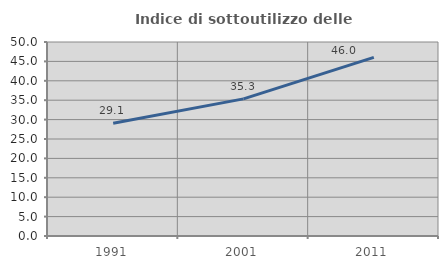
| Category | Indice di sottoutilizzo delle abitazioni  |
|---|---|
| 1991.0 | 29.077 |
| 2001.0 | 35.335 |
| 2011.0 | 46.045 |